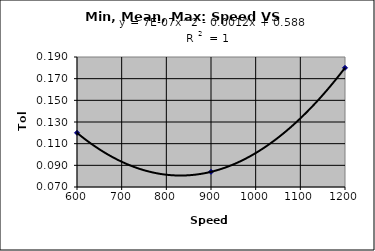
| Category | TOL, mm |
|---|---|
| 600.0 | 0.12 |
| 900.0 | 0.084 |
| 1200.0 | 0.18 |